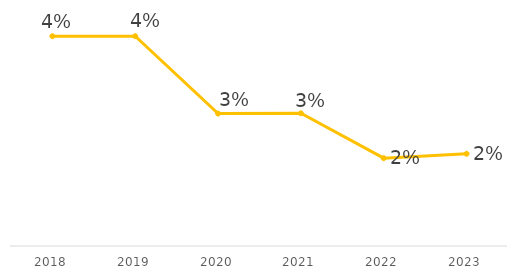
| Category | Series 0 |
|---|---|
| 2018.0 | 0.04 |
| 2019.0 | 0.04 |
| 2020.0 | 0.025 |
| 2021.0 | 0.025 |
| 2022.0 | 0.017 |
| 2023.0 | 0.018 |